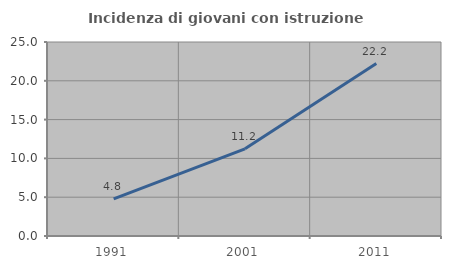
| Category | Incidenza di giovani con istruzione universitaria |
|---|---|
| 1991.0 | 4.787 |
| 2001.0 | 11.23 |
| 2011.0 | 22.222 |